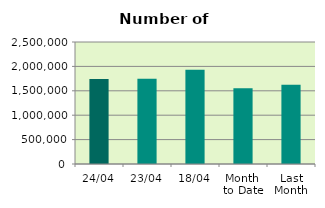
| Category | Series 0 |
|---|---|
| 24/04 | 1744068 |
| 23/04 | 1744824 |
| 18/04 | 1933094 |
| Month 
to Date | 1550371.75 |
| Last
Month | 1624932.286 |